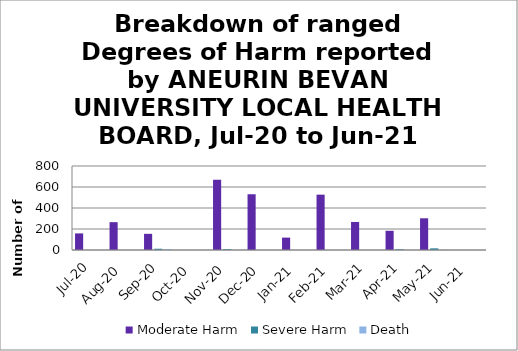
| Category | Moderate Harm | Severe Harm | Death |
|---|---|---|---|
| Jul-20 | 158 | 0 | 0 |
| Aug-20 | 265 | 0 | 0 |
| Sep-20 | 154 | 12 | 9 |
| Oct-20 | 0 | 0 | 0 |
| Nov-20 | 669 | 8 | 0 |
| Dec-20 | 531 | 0 | 0 |
| Jan-21 | 118 | 0 | 0 |
| Feb-21 | 527 | 0 | 0 |
| Mar-21 | 267 | 0 | 0 |
| Apr-21 | 183 | 7 | 0 |
| May-21 | 302 | 16 | 2 |
| Jun-21 | 0 | 0 | 0 |